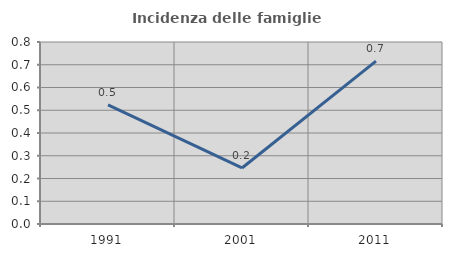
| Category | Incidenza delle famiglie numerose |
|---|---|
| 1991.0 | 0.524 |
| 2001.0 | 0.246 |
| 2011.0 | 0.716 |